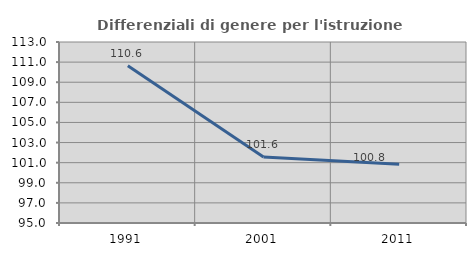
| Category | Differenziali di genere per l'istruzione superiore |
|---|---|
| 1991.0 | 110.648 |
| 2001.0 | 101.575 |
| 2011.0 | 100.848 |